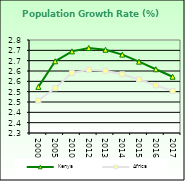
| Category | Kenya | Africa  |
|---|---|---|
| 2000.0 | 2.523 | 2.458 |
| 2005.0 | 2.647 | 2.516 |
| 2010.0 | 2.695 | 2.59 |
| 2012.0 | 2.711 | 2.606 |
| 2013.0 | 2.703 | 2.601 |
| 2014.0 | 2.679 | 2.584 |
| 2015.0 | 2.645 | 2.559 |
| 2016.0 | 2.608 | 2.531 |
| 2017.0 | 2.572 | 2.503 |